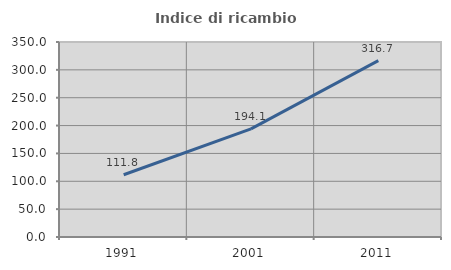
| Category | Indice di ricambio occupazionale  |
|---|---|
| 1991.0 | 111.765 |
| 2001.0 | 194.118 |
| 2011.0 | 316.667 |